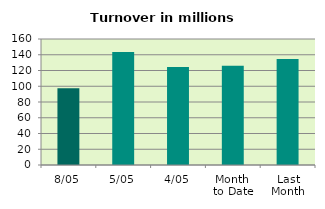
| Category | Series 0 |
|---|---|
| 8/05 | 97.598 |
| 5/05 | 143.537 |
| 4/05 | 124.502 |
| Month 
to Date | 126.06 |
| Last
Month | 134.694 |